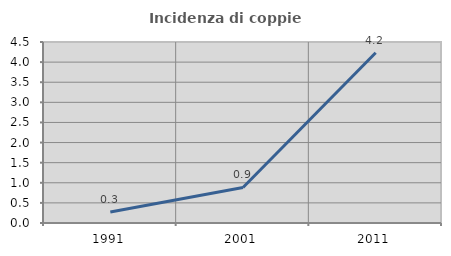
| Category | Incidenza di coppie miste |
|---|---|
| 1991.0 | 0.272 |
| 2001.0 | 0.884 |
| 2011.0 | 4.235 |